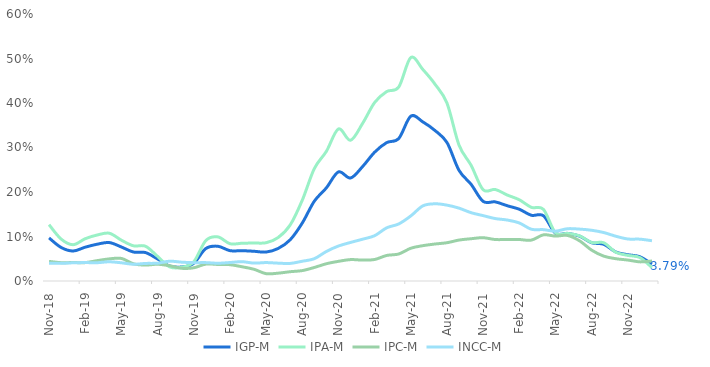
| Category | IGP-M | IPA-M | IPC-M | INCC-M |
|---|---|---|---|---|
| 2018-11-01 | 0.097 | 0.127 | 0.044 | 0.04 |
| 2018-12-01 | 0.075 | 0.094 | 0.041 | 0.04 |
| 2019-01-01 | 0.067 | 0.082 | 0.042 | 0.041 |
| 2019-02-01 | 0.076 | 0.095 | 0.041 | 0.041 |
| 2019-03-01 | 0.083 | 0.103 | 0.046 | 0.041 |
| 2019-04-01 | 0.086 | 0.107 | 0.05 | 0.043 |
| 2019-05-01 | 0.076 | 0.092 | 0.051 | 0.041 |
| 2019-06-01 | 0.065 | 0.079 | 0.039 | 0.038 |
| 2019-07-01 | 0.064 | 0.078 | 0.036 | 0.04 |
| 2019-08-01 | 0.05 | 0.055 | 0.038 | 0.04 |
| 2019-09-01 | 0.034 | 0.032 | 0.034 | 0.044 |
| 2019-10-01 | 0.032 | 0.031 | 0.028 | 0.042 |
| 2019-11-01 | 0.04 | 0.043 | 0.03 | 0.041 |
| 2019-12-01 | 0.073 | 0.091 | 0.038 | 0.041 |
| 2020-01-01 | 0.078 | 0.099 | 0.037 | 0.04 |
| 2020-02-01 | 0.068 | 0.084 | 0.037 | 0.042 |
| 2020-03-01 | 0.068 | 0.085 | 0.032 | 0.043 |
| 2020-04-01 | 0.067 | 0.085 | 0.026 | 0.04 |
| 2020-05-01 | 0.065 | 0.086 | 0.016 | 0.041 |
| 2020-06-01 | 0.073 | 0.098 | 0.018 | 0.04 |
| 2020-07-01 | 0.093 | 0.126 | 0.021 | 0.04 |
| 2020-08-01 | 0.13 | 0.182 | 0.023 | 0.044 |
| 2020-09-01 | 0.179 | 0.253 | 0.03 | 0.05 |
| 2020-10-01 | 0.209 | 0.291 | 0.039 | 0.066 |
| 2020-11-01 | 0.245 | 0.342 | 0.044 | 0.079 |
| 2020-12-01 | 0.231 | 0.316 | 0.048 | 0.087 |
| 2021-01-01 | 0.257 | 0.354 | 0.047 | 0.094 |
| 2021-02-01 | 0.289 | 0.401 | 0.048 | 0.102 |
| 2021-03-01 | 0.311 | 0.426 | 0.057 | 0.12 |
| 2021-04-01 | 0.32 | 0.436 | 0.061 | 0.128 |
| 2021-05-01 | 0.37 | 0.502 | 0.074 | 0.146 |
| 2021-06-01 | 0.358 | 0.475 | 0.079 | 0.169 |
| 2021-07-01 | 0.338 | 0.442 | 0.083 | 0.174 |
| 2021-08-01 | 0.311 | 0.4 | 0.086 | 0.17 |
| 2021-09-01 | 0.249 | 0.305 | 0.092 | 0.164 |
| 2021-10-01 | 0.217 | 0.26 | 0.095 | 0.154 |
| 2021-11-01 | 0.179 | 0.205 | 0.097 | 0.147 |
| 2021-12-01 | 0.178 | 0.206 | 0.093 | 0.14 |
| 2022-01-01 | 0.169 | 0.193 | 0.093 | 0.137 |
| 2022-02-01 | 0.161 | 0.182 | 0.093 | 0.13 |
| 2022-03-01 | 0.148 | 0.166 | 0.092 | 0.116 |
| 2022-04-01 | 0.147 | 0.161 | 0.104 | 0.115 |
| 2022-05-01 | 0.107 | 0.108 | 0.101 | 0.112 |
| 2022-06-01 | 0.107 | 0.107 | 0.102 | 0.118 |
| 2022-07-01 | 0.101 | 0.101 | 0.09 | 0.117 |
| 2022-08-01 | 0.086 | 0.086 | 0.069 | 0.114 |
| 2022-09-01 | 0.082 | 0.086 | 0.056 | 0.109 |
| 2022-10-01 | 0.065 | 0.065 | 0.05 | 0.101 |
| 2022-11-01 | 0.059 | 0.058 | 0.047 | 0.094 |
| 2022-12-01 | 0.054 | 0.053 | 0.043 | 0.094 |
| 2023-01-01 | 0.038 | 0.03 | 0.045 | 0.09 |